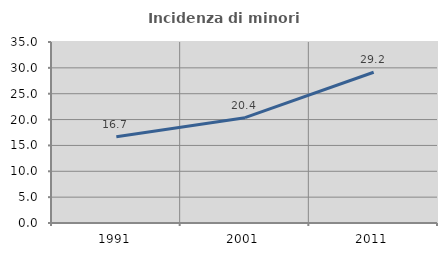
| Category | Incidenza di minori stranieri |
|---|---|
| 1991.0 | 16.667 |
| 2001.0 | 20.37 |
| 2011.0 | 29.153 |